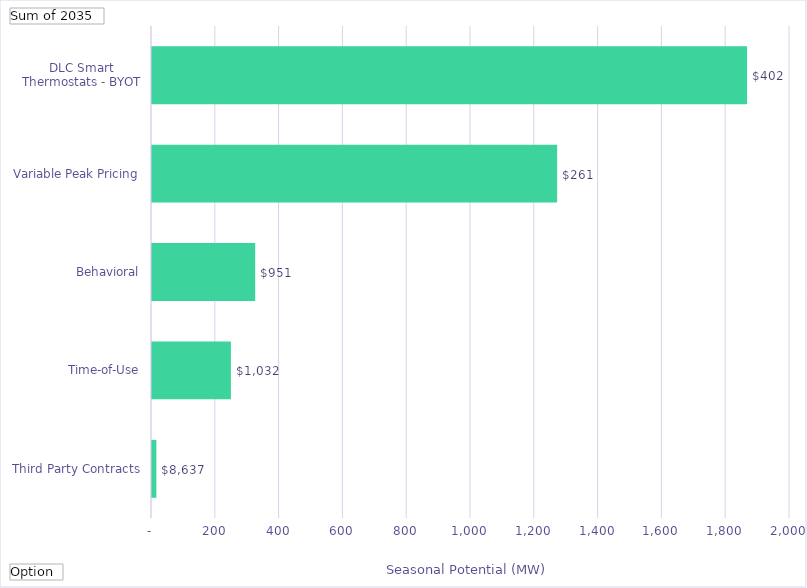
| Category | Winter Peak Reduction @Meter  (Therms) |
|---|---|
| Third Party Contracts | 13.724 |
| Time-of-Use | 247.341 |
| Behavioral | 323.405 |
| Variable Peak Pricing | 1269.984 |
| DLC Smart Thermostats - BYOT | 1865.403 |